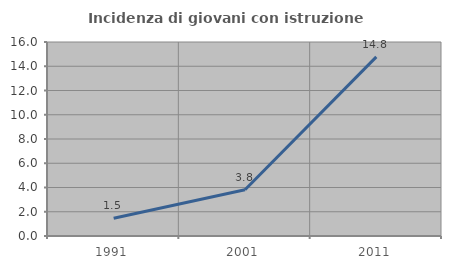
| Category | Incidenza di giovani con istruzione universitaria |
|---|---|
| 1991.0 | 1.465 |
| 2001.0 | 3.817 |
| 2011.0 | 14.777 |